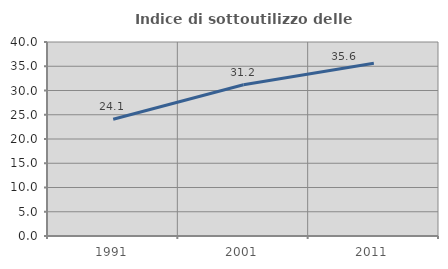
| Category | Indice di sottoutilizzo delle abitazioni  |
|---|---|
| 1991.0 | 24.074 |
| 2001.0 | 31.183 |
| 2011.0 | 35.638 |